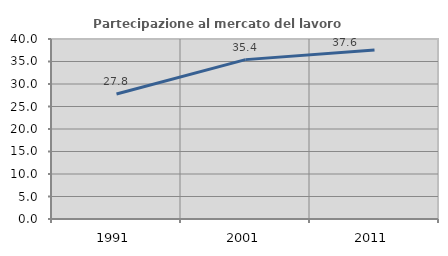
| Category | Partecipazione al mercato del lavoro  femminile |
|---|---|
| 1991.0 | 27.778 |
| 2001.0 | 35.417 |
| 2011.0 | 37.57 |